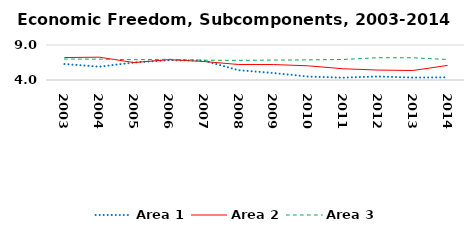
| Category | Area 1 | Area 2 | Area 3 |
|---|---|---|---|
| 2003.0 | 6.286 | 7.208 | 6.994 |
| 2004.0 | 5.906 | 7.261 | 6.978 |
| 2005.0 | 6.499 | 6.49 | 6.898 |
| 2006.0 | 6.839 | 6.913 | 6.958 |
| 2007.0 | 6.771 | 6.644 | 6.832 |
| 2008.0 | 5.401 | 6.211 | 6.803 |
| 2009.0 | 4.999 | 6.208 | 6.85 |
| 2010.0 | 4.49 | 6.025 | 6.875 |
| 2011.0 | 4.338 | 5.606 | 6.933 |
| 2012.0 | 4.505 | 5.421 | 7.184 |
| 2013.0 | 4.346 | 5.356 | 7.176 |
| 2014.0 | 4.387 | 6.083 | 6.929 |